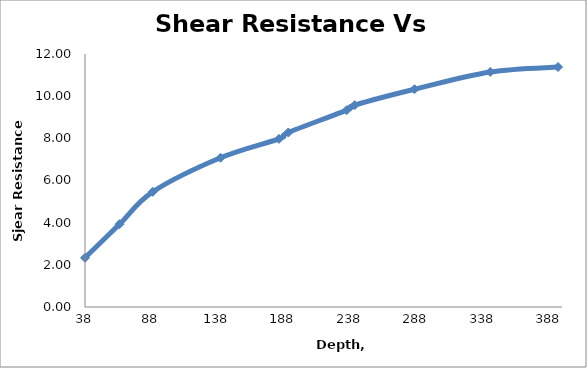
| Category | Shear Resistance Vs Depth  |
|---|---|
| 38.0 | 2.333 |
| 64.0 | 3.929 |
| 89.0 | 5.464 |
| 140.0 | 7.079 |
| 184.0 | 7.974 |
| 191.0 | 8.278 |
| 235.0 | 9.336 |
| 241.0 | 9.574 |
| 286.0 | 10.329 |
| 343.0 | 11.149 |
| 394.0 | 11.384 |